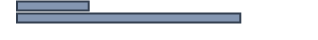
| Category | Percentatge |
|---|---|
| 0 | 24.3 |
| 1 | 75.7 |